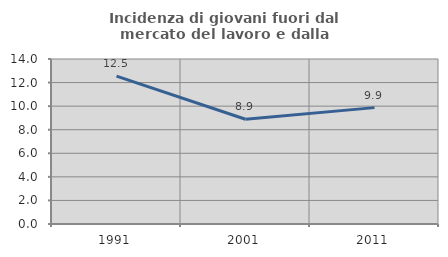
| Category | Incidenza di giovani fuori dal mercato del lavoro e dalla formazione  |
|---|---|
| 1991.0 | 12.544 |
| 2001.0 | 8.889 |
| 2011.0 | 9.874 |